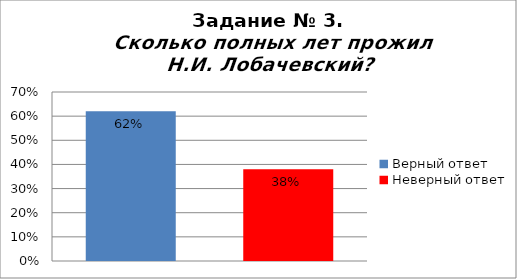
| Category | Сколько полных лет прожил Н.И. Лобачевский? |
|---|---|
| Верный ответ | 0.62 |
| Неверный ответ | 0.38 |